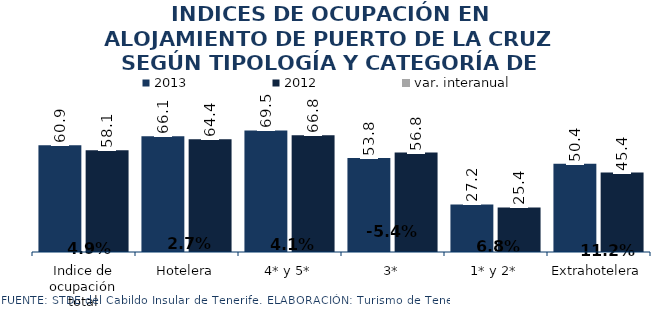
| Category | 2013 | 2012 |
|---|---|---|
| Indice de ocupación total | 60.932 | 58.09 |
| Hotelera | 66.102 | 64.386 |
| 4* y 5* | 69.463 | 66.752 |
| 3* | 53.757 | 56.821 |
| 1* y 2* | 27.164 | 25.431 |
| Extrahotelera | 50.43 | 45.365 |